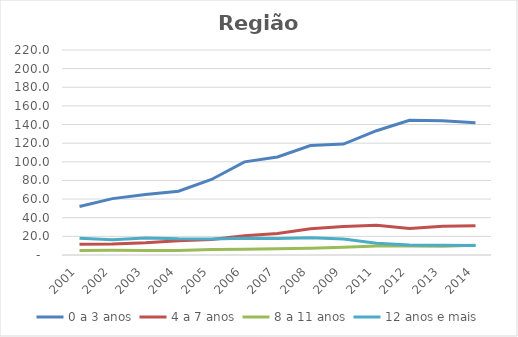
| Category | 0 a 3 anos | 4 a 7 anos | 8 a 11 anos | 12 anos e mais |
|---|---|---|---|---|
| 2001.0 | 52.013 | 11.507 | 4.895 | 17.976 |
| 2002.0 | 60.514 | 11.865 | 5.063 | 16.374 |
| 2003.0 | 64.919 | 13.022 | 4.924 | 18.275 |
| 2004.0 | 68.505 | 15.264 | 4.772 | 17.31 |
| 2005.0 | 81.054 | 16.66 | 5.972 | 17.193 |
| 2006.0 | 99.957 | 20.711 | 6.298 | 17.938 |
| 2007.0 | 105.238 | 23.191 | 6.656 | 17.697 |
| 2008.0 | 117.439 | 28.173 | 7.158 | 18.446 |
| 2009.0 | 119.079 | 30.586 | 8.418 | 17.098 |
| 2011.0 | 133.375 | 32.004 | 9.542 | 12.695 |
| 2012.0 | 144.624 | 28.379 | 9.785 | 10.634 |
| 2013.0 | 144.135 | 30.858 | 9.41 | 10.539 |
| 2014.0 | 142.013 | 31.422 | 10.444 | 10.121 |